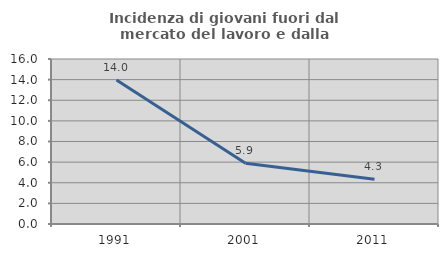
| Category | Incidenza di giovani fuori dal mercato del lavoro e dalla formazione  |
|---|---|
| 1991.0 | 13.953 |
| 2001.0 | 5.882 |
| 2011.0 | 4.348 |